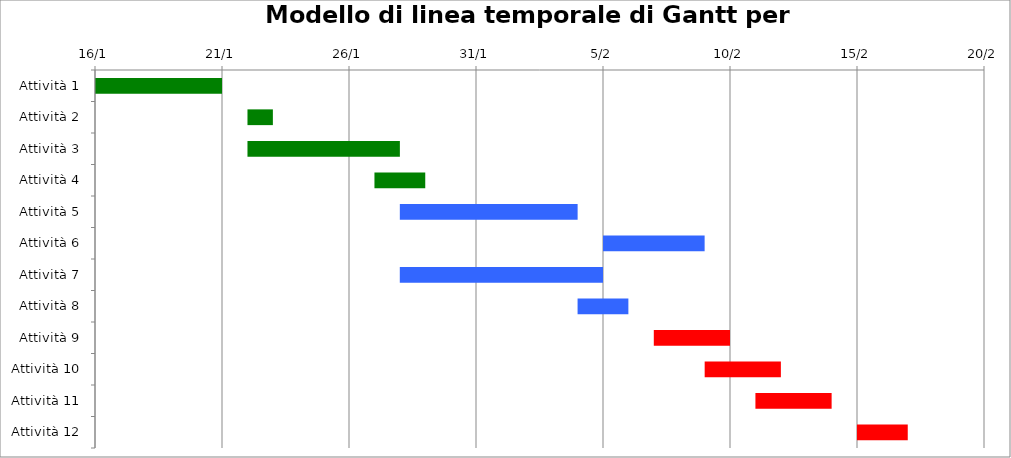
| Category | Inizio | Durata (giorni) |
|---|---|---|
| Attività 1 | 2015-01-16 | 5 |
| Attività 2 | 2015-01-22 | 1 |
| Attività 3 | 2015-01-22 | 6 |
| Attività 4 | 2015-01-27 | 2 |
| Attività 5 | 2015-01-28 | 7 |
| Attività 6 | 2015-02-05 | 4 |
| Attività 7 | 2015-01-28 | 8 |
| Attività 8 | 2015-02-04 | 2 |
| Attività 9 | 2015-02-07 | 3 |
| Attività 10 | 2015-02-09 | 3 |
| Attività 11 | 2015-02-11 | 3 |
| Attività 12 | 2015-02-15 | 2 |